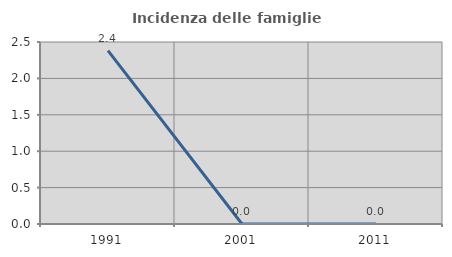
| Category | Incidenza delle famiglie numerose |
|---|---|
| 1991.0 | 2.381 |
| 2001.0 | 0 |
| 2011.0 | 0 |